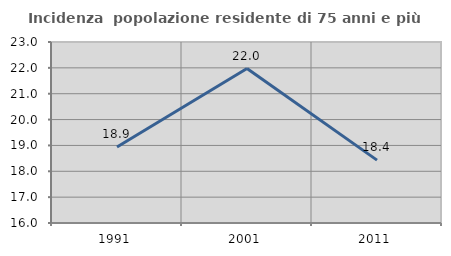
| Category | Incidenza  popolazione residente di 75 anni e più |
|---|---|
| 1991.0 | 18.939 |
| 2001.0 | 21.975 |
| 2011.0 | 18.431 |